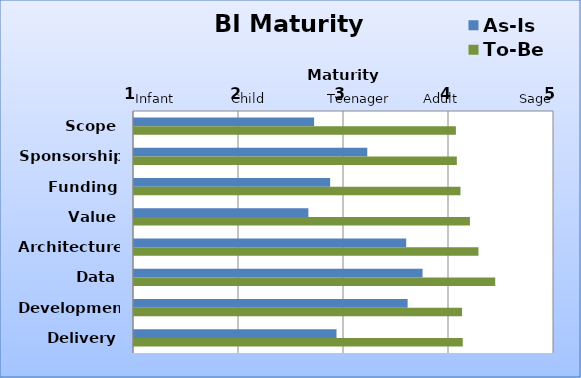
| Category | As-Is | To-Be |
|---|---|---|
| Scope | 2.715 | 4.066 |
| Sponsorship | 3.222 | 4.075 |
| Funding | 2.868 | 4.109 |
| Value | 2.661 | 4.199 |
| Architecture | 3.593 | 4.281 |
| Data | 3.748 | 4.44 |
| Development | 3.606 | 4.124 |
| Delivery | 2.929 | 4.131 |